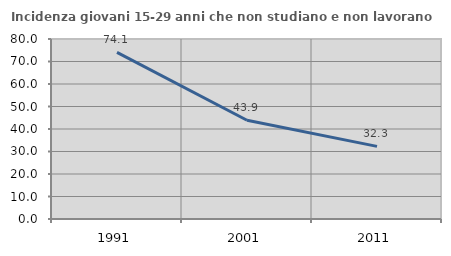
| Category | Incidenza giovani 15-29 anni che non studiano e non lavorano  |
|---|---|
| 1991.0 | 74.083 |
| 2001.0 | 43.891 |
| 2011.0 | 32.275 |